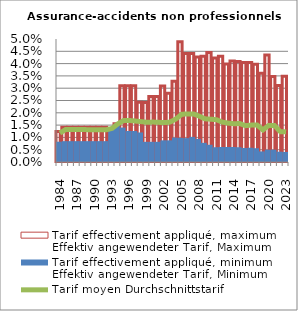
| Category | Tarif effectivement appliqué, maximum | Tarif effectivement appliqué, minimum |
|---|---|---|
| 1984.0 | 0.012 | 0.008 |
| 1985.0 | 0.014 | 0.008 |
| 1986.0 | 0.014 | 0.008 |
| 1987.0 | 0.014 | 0.008 |
| 1988.0 | 0.014 | 0.008 |
| 1989.0 | 0.014 | 0.008 |
| 1990.0 | 0.014 | 0.008 |
| 1991.0 | 0.014 | 0.008 |
| 1992.0 | 0.014 | 0.008 |
| 1993.0 | 0.014 | 0.014 |
| 1994.0 | 0.016 | 0.016 |
| 1995.0 | 0.031 | 0.014 |
| 1996.0 | 0.031 | 0.013 |
| 1997.0 | 0.031 | 0.013 |
| 1998.0 | 0.024 | 0.012 |
| 1999.0 | 0.024 | 0.008 |
| 2000.0 | 0.027 | 0.008 |
| 2001.0 | 0.027 | 0.008 |
| 2002.0 | 0.031 | 0.009 |
| 2003.0 | 0.028 | 0.009 |
| 2004.0 | 0.033 | 0.01 |
| 2005.0 | 0.049 | 0.01 |
| 2006.0 | 0.044 | 0.01 |
| 2007.0 | 0.044 | 0.01 |
| 2008.0 | 0.043 | 0.009 |
| 2009.0 | 0.043 | 0.008 |
| 2010.0 | 0.044 | 0.007 |
| 2011.0 | 0.042 | 0.006 |
| 2012.0 | 0.043 | 0.006 |
| 2013.0 | 0.04 | 0.006 |
| 2014.0 | 0.041 | 0.006 |
| 2015.0 | 0.041 | 0.006 |
| 2016.0 | 0.04 | 0.006 |
| 2017.0 | 0.04 | 0.006 |
| 2018.0 | 0.04 | 0.006 |
| 2019.0 | 0.036 | 0.004 |
| 2020.0 | 0.044 | 0.005 |
| 2021.0 | 0.035 | 0.005 |
| 2022.0 | 0.031 | 0.004 |
| 2023.0 | 0.035 | 0.004 |